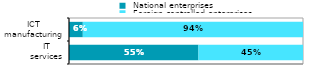
| Category |  National enterprises |  Foreign-controlled enterprises |
|---|---|---|
|  IT 
services | 0.553 | 0.447 |
|  ICT 
manufacturing | 0.059 | 0.941 |